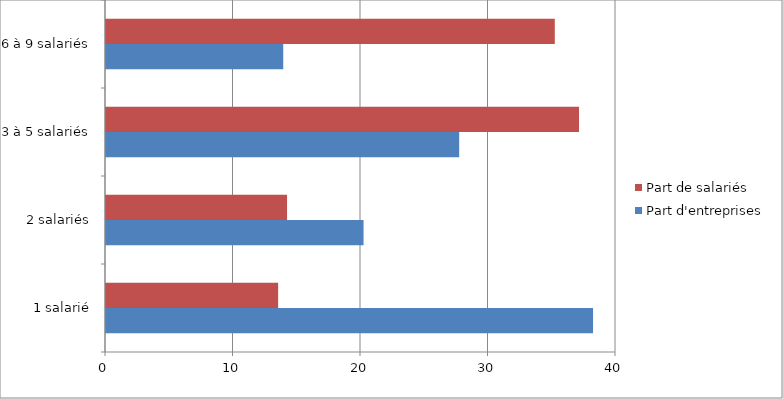
| Category | Part d'entreprises | Part de salariés |
|---|---|---|
| 1 salarié | 38.2 | 13.5 |
| 2 salariés | 20.2 | 14.2 |
| 3 à 5 salariés | 27.7 | 37.1 |
| 6 à 9 salariés | 13.9 | 35.2 |